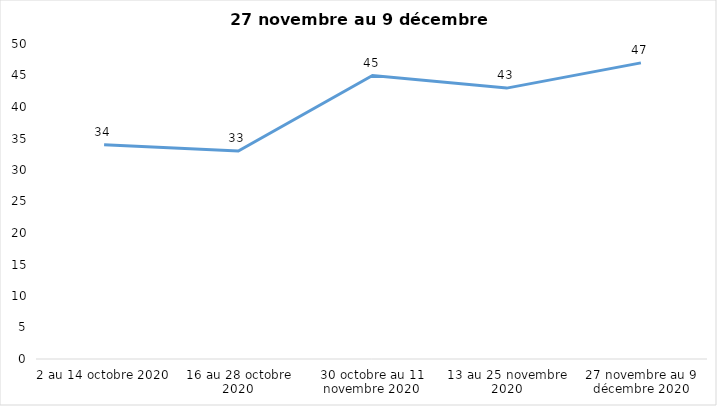
| Category | Series 0 |
|---|---|
| 2 au 14 octobre 2020 | 34 |
| 16 au 28 octobre 2020 | 33 |
| 30 octobre au 11 novembre 2020 | 45 |
| 13 au 25 novembre 2020 | 43 |
| 27 novembre au 9 décembre 2020 | 47 |